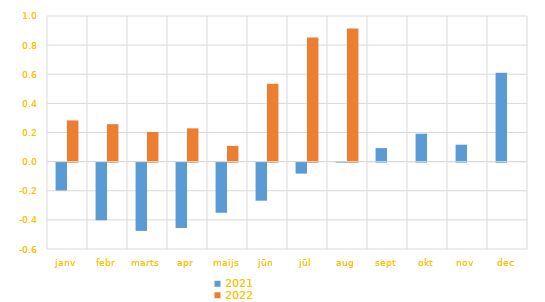
| Category | 2021 | 2022 |
|---|---|---|
| janv | -0.191 | 0.283 |
| febr | -0.396 | 0.257 |
| marts | -0.469 | 0.204 |
| apr | -0.449 | 0.229 |
| maijs | -0.344 | 0.108 |
| jūn | -0.261 | 0.534 |
| jūl | -0.075 | 0.852 |
| aug | 0.004 | 0.913 |
| sept | 0.093 | 0 |
| okt | 0.192 | 0 |
| nov | 0.116 | 0 |
| dec | 0.61 | 0 |